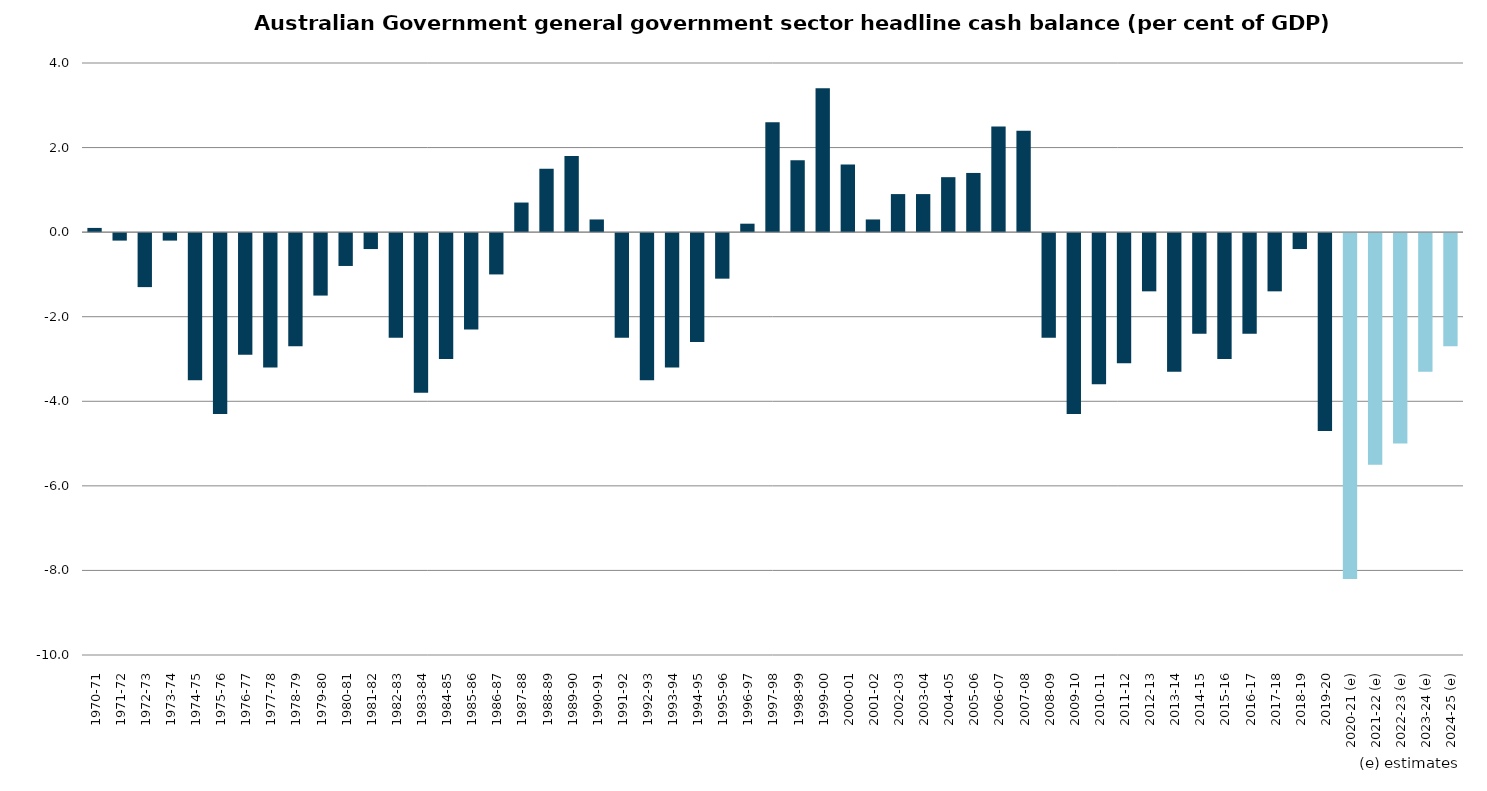
| Category | Headline cash balance |
|---|---|
| 1970-71 | 0.1 |
| 1971-72 | -0.2 |
| 1972-73 | -1.3 |
| 1973-74 | -0.2 |
| 1974-75 | -3.5 |
| 1975-76 | -4.3 |
| 1976-77 | -2.9 |
| 1977-78 | -3.2 |
| 1978-79 | -2.7 |
| 1979-80 | -1.5 |
| 1980-81 | -0.8 |
| 1981-82 | -0.4 |
| 1982-83 | -2.5 |
| 1983-84 | -3.8 |
| 1984-85 | -3 |
| 1985-86 | -2.3 |
| 1986-87 | -1 |
| 1987-88 | 0.7 |
| 1988-89 | 1.5 |
| 1989-90 | 1.8 |
| 1990-91 | 0.3 |
| 1991-92 | -2.5 |
| 1992-93 | -3.5 |
| 1993-94 | -3.2 |
| 1994-95 | -2.6 |
| 1995-96 | -1.1 |
| 1996-97 | 0.2 |
| 1997-98 | 2.6 |
| 1998-99 | 1.7 |
| 1999-00 | 3.4 |
| 2000-01 | 1.6 |
| 2001-02 | 0.3 |
| 2002-03 | 0.9 |
| 2003-04 | 0.9 |
| 2004-05 | 1.3 |
| 2005-06 | 1.4 |
| 2006-07 | 2.5 |
| 2007-08 | 2.4 |
| 2008-09 | -2.5 |
| 2009-10 | -4.3 |
| 2010-11 | -3.6 |
| 2011-12 | -3.1 |
| 2012-13 | -1.4 |
| 2013-14 | -3.3 |
| 2014-15 | -2.4 |
| 2015-16 | -3 |
| 2016-17 | -2.4 |
| 2017-18 | -1.4 |
| 2018-19 | -0.4 |
| 2019-20 | -4.7 |
| 2020-21 (e) | -8.2 |
| 2021-22 (e) | -5.5 |
| 2022-23 (e) | -5 |
| 2023-24 (e) | -3.3 |
| 2024-25 (e) | -2.7 |